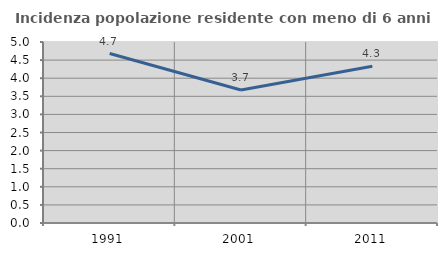
| Category | Incidenza popolazione residente con meno di 6 anni |
|---|---|
| 1991.0 | 4.682 |
| 2001.0 | 3.675 |
| 2011.0 | 4.331 |